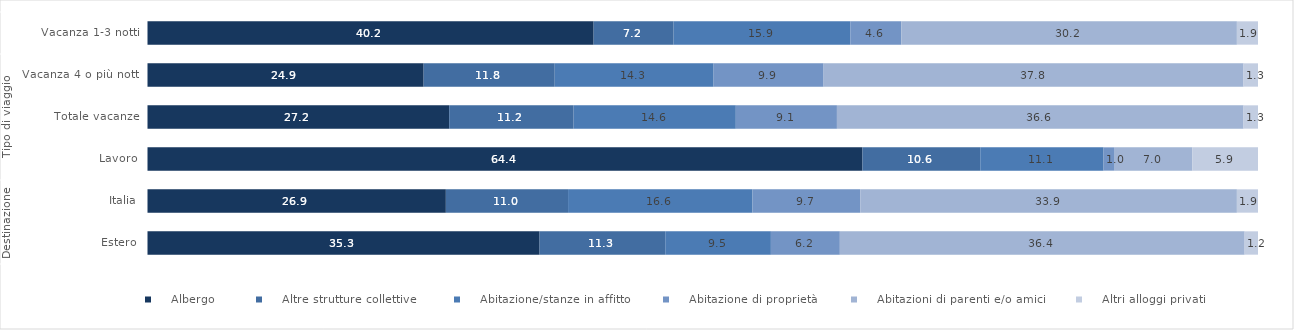
| Category |     Albergo  |     Altre strutture collettive  |     Abitazione/stanze in affitto |     Abitazione di proprietà |     Abitazioni di parenti e/o amici |     Altri alloggi privati |
|---|---|---|---|---|---|---|
| 0 | 40.2 | 7.2 | 15.9 | 4.6 | 30.2 | 1.9 |
| 1 | 24.9 | 11.8 | 14.3 | 9.9 | 37.8 | 1.3 |
| 2 | 27.2 | 11.2 | 14.6 | 9.1 | 36.6 | 1.3 |
| 3 | 64.4 | 10.6 | 11.1 | 1 | 7 | 5.9 |
| 4 | 26.9 | 11 | 16.6 | 9.7 | 33.9 | 1.9 |
| 5 | 35.3 | 11.3 | 9.5 | 6.2 | 36.4 | 1.2 |